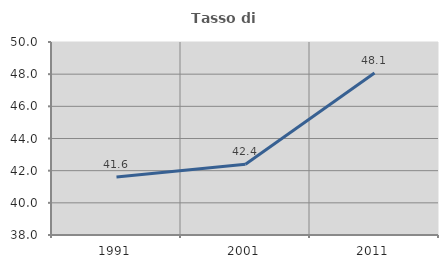
| Category | Tasso di occupazione   |
|---|---|
| 1991.0 | 41.61 |
| 2001.0 | 42.393 |
| 2011.0 | 48.072 |